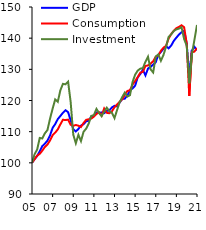
| Category | GDP | Consumption | Investment |
|---|---|---|---|
| 2005-03-31 | 100 | 100 | 100 |
| 2005-06-30 | 101.183 | 101.168 | 102.773 |
| 2005-09-30 | 102.178 | 102.318 | 104.258 |
| 2005-12-31 | 103.705 | 102.87 | 107.981 |
| 2006-03-31 | 105.373 | 103.915 | 107.809 |
| 2006-06-30 | 106.151 | 105.097 | 109.475 |
| 2006-09-30 | 107.135 | 105.892 | 110.536 |
| 2006-12-31 | 108.824 | 107.174 | 114.197 |
| 2007-03-31 | 111.216 | 108.874 | 117.378 |
| 2007-06-30 | 112.428 | 109.692 | 120.354 |
| 2007-09-30 | 114.03 | 110.723 | 119.578 |
| 2007-12-31 | 115.027 | 112.332 | 123.284 |
| 2008-03-31 | 116.071 | 113.834 | 125.354 |
| 2008-06-30 | 116.892 | 113.718 | 125.19 |
| 2008-09-30 | 116.254 | 113.868 | 126.054 |
| 2008-12-31 | 113.628 | 112.209 | 119.483 |
| 2009-03-31 | 110.812 | 111.877 | 109.068 |
| 2009-06-30 | 110.059 | 112.14 | 106.284 |
| 2009-09-30 | 110.855 | 111.906 | 109.002 |
| 2009-12-31 | 111.954 | 111.513 | 106.977 |
| 2010-03-31 | 112.392 | 112.774 | 109.969 |
| 2010-06-30 | 113.318 | 113.799 | 110.961 |
| 2010-09-30 | 113.506 | 113.962 | 112.578 |
| 2010-12-31 | 114.885 | 114.206 | 115.046 |
| 2011-03-31 | 115.083 | 114.815 | 115.333 |
| 2011-06-30 | 116.158 | 115.663 | 117.298 |
| 2011-09-30 | 115.95 | 116.242 | 116 |
| 2011-12-31 | 116.197 | 115.13 | 114.961 |
| 2012-03-31 | 115.939 | 117.436 | 116.45 |
| 2012-06-30 | 116.666 | 116.042 | 117.693 |
| 2012-09-30 | 116.838 | 115.916 | 116.587 |
| 2012-12-31 | 117.775 | 116.527 | 116.053 |
| 2013-03-31 | 118.293 | 117.841 | 114.35 |
| 2013-06-30 | 118.091 | 118.701 | 116.947 |
| 2013-09-30 | 119.36 | 119.598 | 119.486 |
| 2013-12-31 | 120.488 | 120.376 | 121.116 |
| 2014-03-31 | 120.584 | 121.857 | 122.544 |
| 2014-06-30 | 121.636 | 123.064 | 121.252 |
| 2014-09-30 | 123.287 | 123.299 | 121.704 |
| 2014-12-31 | 123.888 | 125.081 | 125.922 |
| 2015-03-31 | 124.748 | 126.262 | 128.274 |
| 2015-06-30 | 127.431 | 127.474 | 129.586 |
| 2015-09-30 | 128.484 | 128.94 | 130.22 |
| 2015-12-31 | 129.887 | 129.179 | 130.387 |
| 2016-03-31 | 128.054 | 131.085 | 132.422 |
| 2016-06-30 | 130.248 | 131.248 | 134.036 |
| 2016-09-30 | 130.792 | 131.837 | 129.994 |
| 2016-12-31 | 131.526 | 132.592 | 128.993 |
| 2017-03-31 | 132.295 | 134.056 | 134.1 |
| 2017-06-30 | 134.702 | 134.513 | 134.79 |
| 2017-09-30 | 135.559 | 135.948 | 132.744 |
| 2017-12-31 | 136.66 | 136.947 | 134.619 |
| 2018-03-31 | 137.43 | 137.529 | 137.287 |
| 2018-06-30 | 136.731 | 139.899 | 140.41 |
| 2018-09-30 | 137.643 | 141.319 | 141.255 |
| 2018-12-31 | 139.132 | 142.371 | 142.31 |
| 2019-03-31 | 140.167 | 143.19 | 142.814 |
| 2019-06-30 | 141.15 | 143.613 | 143.065 |
| 2019-09-30 | 141.903 | 144.135 | 143.49 |
| 2019-12-31 | 142.367 | 143.513 | 139.723 |
| 2020-03-31 | 138.322 | 138.383 | 137.626 |
| 2020-06-30 | 127.312 | 121.423 | 125.523 |
| 2020-09-30 | 135.992 | 135.463 | 134.766 |
| 2020-12-31 | 137.223 | 135.671 | 139.455 |
| 2021-03-31 | 136.145 | 136.783 | 144.245 |